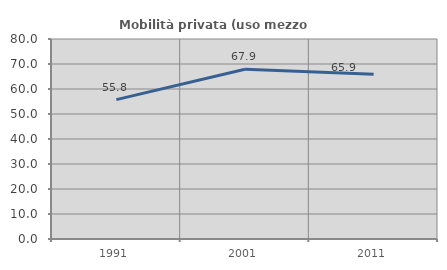
| Category | Mobilità privata (uso mezzo privato) |
|---|---|
| 1991.0 | 55.752 |
| 2001.0 | 67.907 |
| 2011.0 | 65.898 |